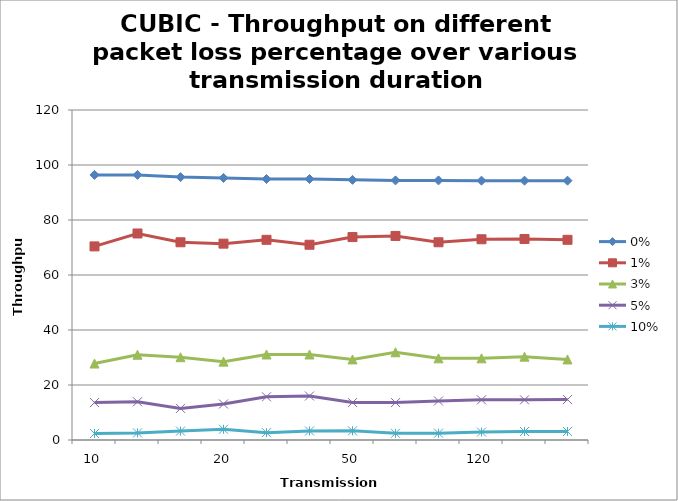
| Category | 0% | 1% | 3% | 5% | 10% |
|---|---|---|---|---|---|
| 10.0 | 96.4 | 70.4 | 27.8 | 13.6 | 2.36 |
| nan | 96.4 | 75.1 | 31 | 13.9 | 2.58 |
| nan | 95.6 | 71.9 | 30.1 | 11.5 | 3.24 |
| 20.0 | 95.3 | 71.4 | 28.5 | 13.1 | 3.91 |
| nan | 94.9 | 72.8 | 31.1 | 15.7 | 2.68 |
| nan | 94.9 | 71 | 31.1 | 16 | 3.28 |
| 50.0 | 94.6 | 73.8 | 29.3 | 13.6 | 3.34 |
| nan | 94.4 | 74.2 | 31.9 | 13.6 | 2.43 |
| nan | 94.4 | 71.9 | 29.7 | 14.2 | 2.48 |
| 120.0 | 94.3 | 73 | 29.7 | 14.6 | 2.89 |
| nan | 94.3 | 73.1 | 30.3 | 14.6 | 3.08 |
| nan | 94.3 | 72.8 | 29.3 | 14.7 | 3.1 |